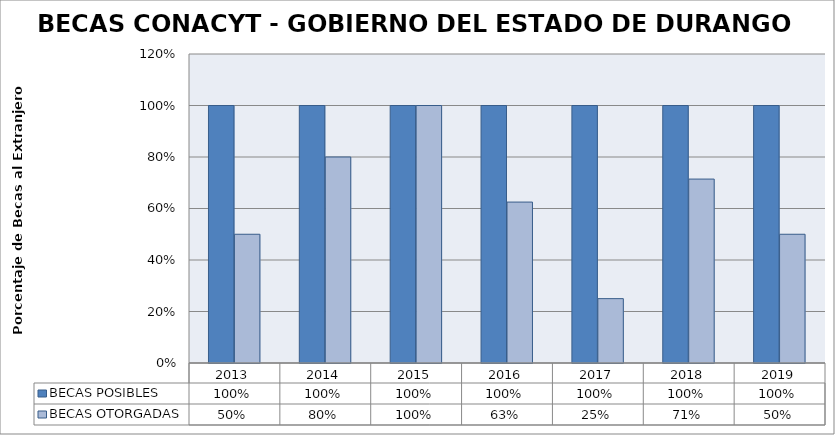
| Category | BECAS POSIBLES | BECAS OTORGADAS  |
|---|---|---|
| 2013.0 | 1 | 0.5 |
| 2014.0 | 1 | 0.8 |
| 2015.0 | 1 | 1 |
| 2016.0 | 1 | 0.625 |
| 2017.0 | 1 | 0.25 |
| 2018.0 | 1 | 0.714 |
| 2019.0 | 1 | 0.5 |